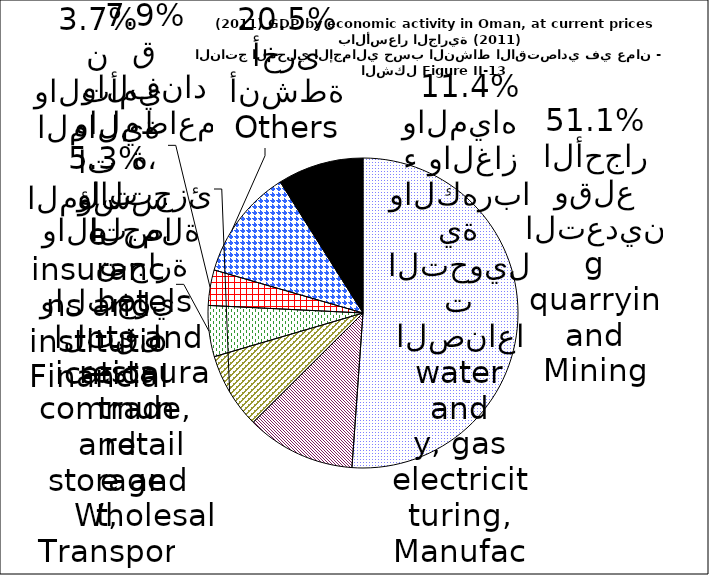
| Category | Series 0 |
|---|---|
| Mining and quarrying | 14294.7 |
| Manufacturing, electricity, gas and water | 3186.9 |
| Wholesale and retail trade, restaurants and hotels | 2213.3 |
| Transport, storage and communication | 1489.3 |
| Financial institutions and insurance | 1033.6 |
| Producers of government services | 3230.2 |
| Others | 2506.3 |